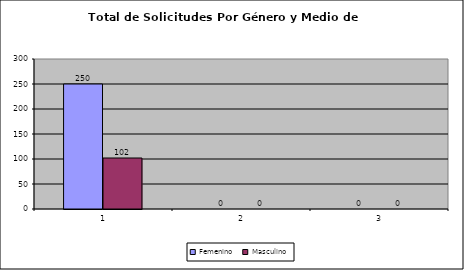
| Category | Femenino | Masculino |
|---|---|---|
| 0 | 250 | 102 |
| 1 | 0 | 0 |
| 2 | 0 | 0 |